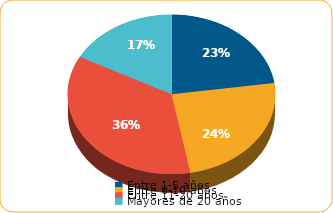
| Category | Series 0 |
|---|---|
| Entre 1-5 años | 2861.5 |
| Entre 6-10 años | 3078.2 |
| Entre 11-20 años | 4502.8 |
| Mayores de 20 años | 2168 |